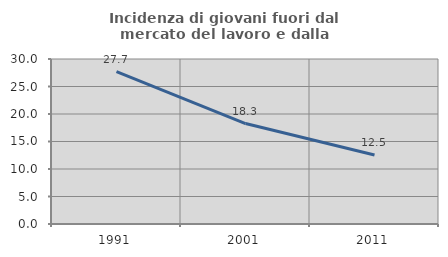
| Category | Incidenza di giovani fuori dal mercato del lavoro e dalla formazione  |
|---|---|
| 1991.0 | 27.701 |
| 2001.0 | 18.266 |
| 2011.0 | 12.544 |